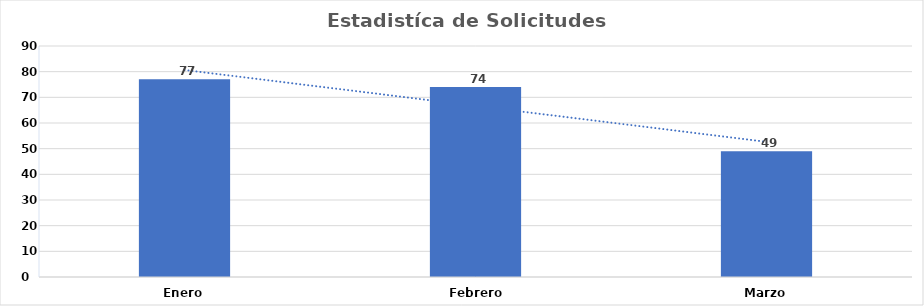
| Category | Series 0 |
|---|---|
| Enero | 77 |
| Febrero  | 74 |
| Marzo | 49 |